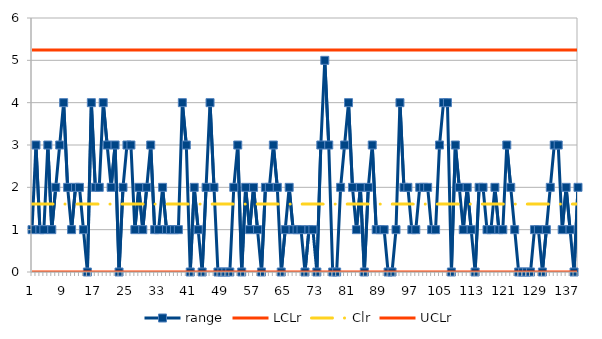
| Category | range | LCLr | Clr | UCLr |
|---|---|---|---|---|
| 0 | 1 | 0 | 1.604 | 5.242 |
| 1 | 3 | 0 | 1.604 | 5.242 |
| 2 | 1 | 0 | 1.604 | 5.242 |
| 3 | 1 | 0 | 1.604 | 5.242 |
| 4 | 3 | 0 | 1.604 | 5.242 |
| 5 | 1 | 0 | 1.604 | 5.242 |
| 6 | 2 | 0 | 1.604 | 5.242 |
| 7 | 3 | 0 | 1.604 | 5.242 |
| 8 | 4 | 0 | 1.604 | 5.242 |
| 9 | 2 | 0 | 1.604 | 5.242 |
| 10 | 1 | 0 | 1.604 | 5.242 |
| 11 | 2 | 0 | 1.604 | 5.242 |
| 12 | 2 | 0 | 1.604 | 5.242 |
| 13 | 1 | 0 | 1.604 | 5.242 |
| 14 | 0 | 0 | 1.604 | 5.242 |
| 15 | 4 | 0 | 1.604 | 5.242 |
| 16 | 2 | 0 | 1.604 | 5.242 |
| 17 | 2 | 0 | 1.604 | 5.242 |
| 18 | 4 | 0 | 1.604 | 5.242 |
| 19 | 3 | 0 | 1.604 | 5.242 |
| 20 | 2 | 0 | 1.604 | 5.242 |
| 21 | 3 | 0 | 1.604 | 5.242 |
| 22 | 0 | 0 | 1.604 | 5.242 |
| 23 | 2 | 0 | 1.604 | 5.242 |
| 24 | 3 | 0 | 1.604 | 5.242 |
| 25 | 3 | 0 | 1.604 | 5.242 |
| 26 | 1 | 0 | 1.604 | 5.242 |
| 27 | 2 | 0 | 1.604 | 5.242 |
| 28 | 1 | 0 | 1.604 | 5.242 |
| 29 | 2 | 0 | 1.604 | 5.242 |
| 30 | 3 | 0 | 1.604 | 5.242 |
| 31 | 1 | 0 | 1.604 | 5.242 |
| 32 | 1 | 0 | 1.604 | 5.242 |
| 33 | 2 | 0 | 1.604 | 5.242 |
| 34 | 1 | 0 | 1.604 | 5.242 |
| 35 | 1 | 0 | 1.604 | 5.242 |
| 36 | 1 | 0 | 1.604 | 5.242 |
| 37 | 1 | 0 | 1.604 | 5.242 |
| 38 | 4 | 0 | 1.604 | 5.242 |
| 39 | 3 | 0 | 1.604 | 5.242 |
| 40 | 0 | 0 | 1.604 | 5.242 |
| 41 | 2 | 0 | 1.604 | 5.242 |
| 42 | 1 | 0 | 1.604 | 5.242 |
| 43 | 0 | 0 | 1.604 | 5.242 |
| 44 | 2 | 0 | 1.604 | 5.242 |
| 45 | 4 | 0 | 1.604 | 5.242 |
| 46 | 2 | 0 | 1.604 | 5.242 |
| 47 | 0 | 0 | 1.604 | 5.242 |
| 48 | 0 | 0 | 1.604 | 5.242 |
| 49 | 0 | 0 | 1.604 | 5.242 |
| 50 | 0 | 0 | 1.604 | 5.242 |
| 51 | 2 | 0 | 1.604 | 5.242 |
| 52 | 3 | 0 | 1.604 | 5.242 |
| 53 | 0 | 0 | 1.604 | 5.242 |
| 54 | 2 | 0 | 1.604 | 5.242 |
| 55 | 1 | 0 | 1.604 | 5.242 |
| 56 | 2 | 0 | 1.604 | 5.242 |
| 57 | 1 | 0 | 1.604 | 5.242 |
| 58 | 0 | 0 | 1.604 | 5.242 |
| 59 | 2 | 0 | 1.604 | 5.242 |
| 60 | 2 | 0 | 1.604 | 5.242 |
| 61 | 3 | 0 | 1.604 | 5.242 |
| 62 | 2 | 0 | 1.604 | 5.242 |
| 63 | 0 | 0 | 1.604 | 5.242 |
| 64 | 1 | 0 | 1.604 | 5.242 |
| 65 | 2 | 0 | 1.604 | 5.242 |
| 66 | 1 | 0 | 1.604 | 5.242 |
| 67 | 1 | 0 | 1.604 | 5.242 |
| 68 | 1 | 0 | 1.604 | 5.242 |
| 69 | 0 | 0 | 1.604 | 5.242 |
| 70 | 1 | 0 | 1.604 | 5.242 |
| 71 | 1 | 0 | 1.604 | 5.242 |
| 72 | 0 | 0 | 1.604 | 5.242 |
| 73 | 3 | 0 | 1.604 | 5.242 |
| 74 | 5 | 0 | 1.604 | 5.242 |
| 75 | 3 | 0 | 1.604 | 5.242 |
| 76 | 0 | 0 | 1.604 | 5.242 |
| 77 | 0 | 0 | 1.604 | 5.242 |
| 78 | 2 | 0 | 1.604 | 5.242 |
| 79 | 3 | 0 | 1.604 | 5.242 |
| 80 | 4 | 0 | 1.604 | 5.242 |
| 81 | 2 | 0 | 1.604 | 5.242 |
| 82 | 1 | 0 | 1.604 | 5.242 |
| 83 | 2 | 0 | 1.604 | 5.242 |
| 84 | 0 | 0 | 1.604 | 5.242 |
| 85 | 2 | 0 | 1.604 | 5.242 |
| 86 | 3 | 0 | 1.604 | 5.242 |
| 87 | 1 | 0 | 1.604 | 5.242 |
| 88 | 1 | 0 | 1.604 | 5.242 |
| 89 | 1 | 0 | 1.604 | 5.242 |
| 90 | 0 | 0 | 1.604 | 5.242 |
| 91 | 0 | 0 | 1.604 | 5.242 |
| 92 | 1 | 0 | 1.604 | 5.242 |
| 93 | 4 | 0 | 1.604 | 5.242 |
| 94 | 2 | 0 | 1.604 | 5.242 |
| 95 | 2 | 0 | 1.604 | 5.242 |
| 96 | 1 | 0 | 1.604 | 5.242 |
| 97 | 1 | 0 | 1.604 | 5.242 |
| 98 | 2 | 0 | 1.604 | 5.242 |
| 99 | 2 | 0 | 1.604 | 5.242 |
| 100 | 2 | 0 | 1.604 | 5.242 |
| 101 | 1 | 0 | 1.604 | 5.242 |
| 102 | 1 | 0 | 1.604 | 5.242 |
| 103 | 3 | 0 | 1.604 | 5.242 |
| 104 | 4 | 0 | 1.604 | 5.242 |
| 105 | 4 | 0 | 1.604 | 5.242 |
| 106 | 0 | 0 | 1.604 | 5.242 |
| 107 | 3 | 0 | 1.604 | 5.242 |
| 108 | 2 | 0 | 1.604 | 5.242 |
| 109 | 1 | 0 | 1.604 | 5.242 |
| 110 | 2 | 0 | 1.604 | 5.242 |
| 111 | 1 | 0 | 1.604 | 5.242 |
| 112 | 0 | 0 | 1.604 | 5.242 |
| 113 | 2 | 0 | 1.604 | 5.242 |
| 114 | 2 | 0 | 1.604 | 5.242 |
| 115 | 1 | 0 | 1.604 | 5.242 |
| 116 | 1 | 0 | 1.604 | 5.242 |
| 117 | 2 | 0 | 1.604 | 5.242 |
| 118 | 1 | 0 | 1.604 | 5.242 |
| 119 | 1 | 0 | 1.604 | 5.242 |
| 120 | 3 | 0 | 1.604 | 5.242 |
| 121 | 2 | 0 | 1.604 | 5.242 |
| 122 | 1 | 0 | 1.604 | 5.242 |
| 123 | 0 | 0 | 1.604 | 5.242 |
| 124 | 0 | 0 | 1.604 | 5.242 |
| 125 | 0 | 0 | 1.604 | 5.242 |
| 126 | 0 | 0 | 1.604 | 5.242 |
| 127 | 1 | 0 | 1.604 | 5.242 |
| 128 | 1 | 0 | 1.604 | 5.242 |
| 129 | 0 | 0 | 1.604 | 5.242 |
| 130 | 1 | 0 | 1.604 | 5.242 |
| 131 | 2 | 0 | 1.604 | 5.242 |
| 132 | 3 | 0 | 1.604 | 5.242 |
| 133 | 3 | 0 | 1.604 | 5.242 |
| 134 | 1 | 0 | 1.604 | 5.242 |
| 135 | 2 | 0 | 1.604 | 5.242 |
| 136 | 1 | 0 | 1.604 | 5.242 |
| 137 | 0 | 0 | 1.604 | 5.242 |
| 138 | 2 | 0 | 1.604 | 5.242 |